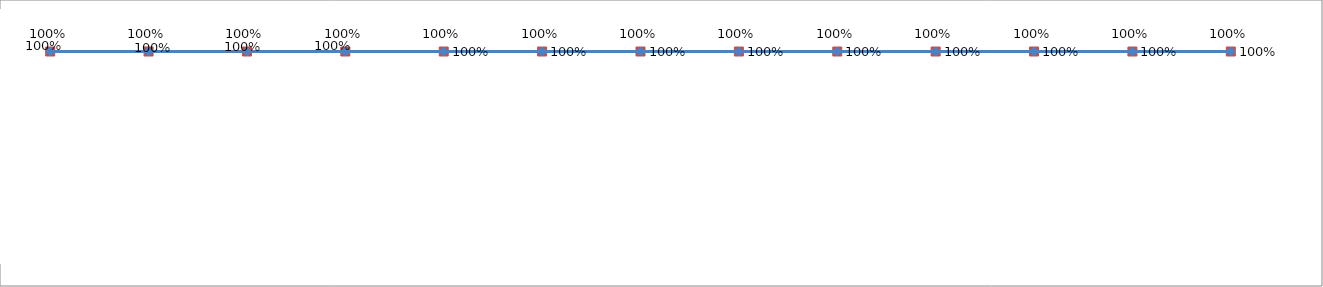
| Category | Índice | Meta |
|---|---|---|
| 0 | 1 | 1 |
| 1 | 1 | 1 |
| 2 | 1 | 1 |
| 3 | 1 | 1 |
| 4 | 1 | 1 |
| 5 | 1 | 1 |
| 6 | 1 | 1 |
| 7 | 1 | 1 |
| 8 | 1 | 1 |
| 9 | 1 | 1 |
| 10 | 1 | 1 |
| 11 | 1 | 1 |
| 12 | 1 | 1 |